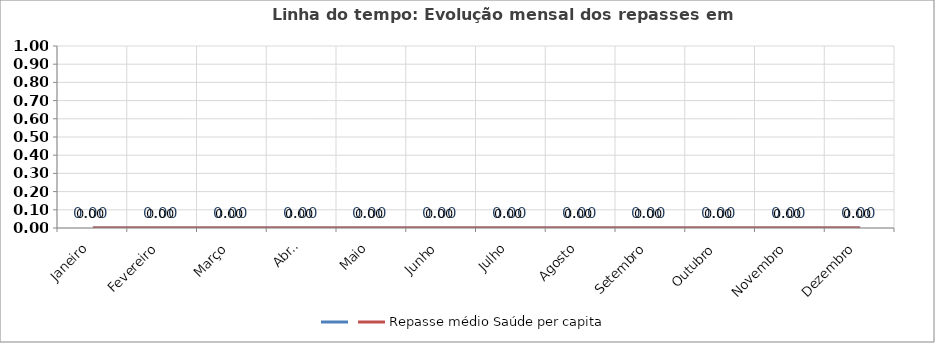
| Category | Series 0 | Repasse médio Saúde per capita |
|---|---|---|
| Janeiro | 0 | 0 |
| Fevereiro | 0 | 0 |
| Março | 0 | 0 |
| Abril | 0 | 0 |
| Maio | 0 | 0 |
| Junho | 0 | 0 |
| Julho | 0 | 0 |
| Agosto | 0 | 0 |
| Setembro | 0 | 0 |
| Outubro | 0 | 0 |
| Novembro | 0 | 0 |
| Dezembro | 0 | 0 |